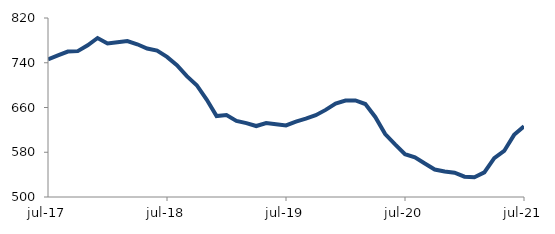
| Category | Series 0 |
|---|---|
| 2017-07-01 | 746.167 |
| 2017-08-01 | 753.171 |
| 2017-09-01 | 760.082 |
| 2017-10-01 | 760.759 |
| 2017-11-01 | 771.137 |
| 2017-12-01 | 784.243 |
| 2018-01-01 | 774.548 |
| 2018-02-01 | 776.834 |
| 2018-03-01 | 778.765 |
| 2018-04-01 | 773.022 |
| 2018-05-01 | 765.388 |
| 2018-06-01 | 761.611 |
| 2018-07-01 | 750.463 |
| 2018-08-01 | 735.626 |
| 2018-09-01 | 716.01 |
| 2018-10-01 | 699.844 |
| 2018-11-01 | 674.142 |
| 2018-12-01 | 644.616 |
| 2019-01-01 | 646.537 |
| 2019-02-01 | 636.077 |
| 2019-03-01 | 632.061 |
| 2019-04-01 | 626.854 |
| 2019-05-01 | 632.115 |
| 2019-06-01 | 630.023 |
| 2019-07-01 | 627.969 |
| 2019-08-01 | 634.691 |
| 2019-09-01 | 640.097 |
| 2019-10-01 | 646.299 |
| 2019-11-01 | 655.72 |
| 2019-12-01 | 667.143 |
| 2020-01-01 | 672.455 |
| 2020-02-01 | 672.659 |
| 2020-03-01 | 666.213 |
| 2020-04-01 | 643.099 |
| 2020-05-01 | 612.513 |
| 2020-06-01 | 594.105 |
| 2020-07-01 | 576.647 |
| 2020-08-01 | 570.999 |
| 2020-09-01 | 559.792 |
| 2020-10-01 | 549.14 |
| 2020-11-01 | 545.553 |
| 2020-12-01 | 543.546 |
| 2021-01-01 | 536.261 |
| 2021-02-01 | 535.415 |
| 2021-03-01 | 544.033 |
| 2021-04-01 | 569.495 |
| 2021-05-01 | 582.319 |
| 2021-06-01 | 611.127 |
| 2021-07-01 | 626.486 |